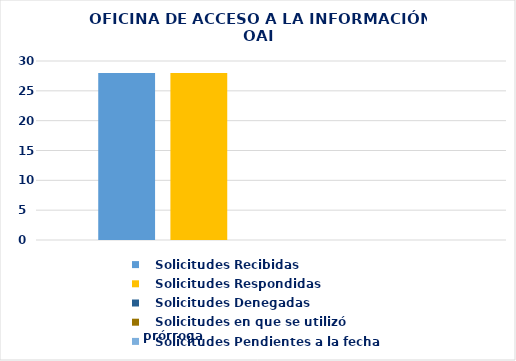
| Category |    Solicitudes Recibidas |    Solicitudes Respondidas |    Solicitudes Denegadas |    Solicitudes en que se utilizó prórroga |    Solicitudes Pendientes a la fecha |
|---|---|---|---|---|---|
| 0 | 28 | 28 | 0 | 0 | 0 |